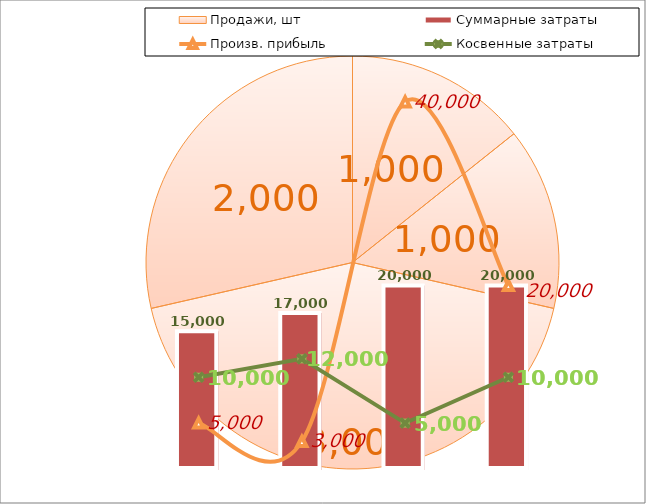
| Category | Суммарные затраты |
|---|---|
| 1 квартал | 15000 |
| 2 квартал | 17000 |
| 3 квартал | 20000 |
| 4 квартал | 20000 |